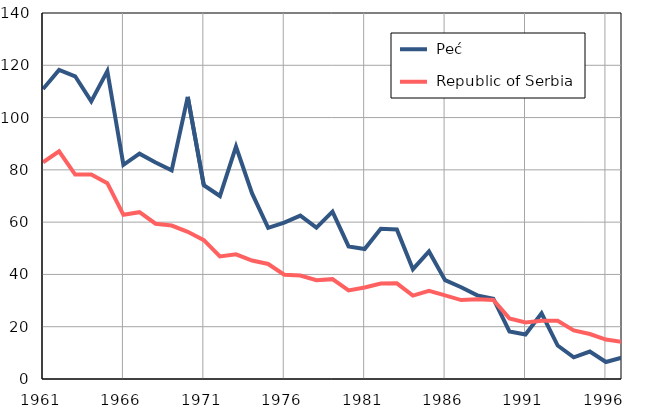
| Category |  Peć |  Republic of Serbia |
|---|---|---|
| 1961.0 | 110.9 | 82.9 |
| 1962.0 | 118.2 | 87.1 |
| 1963.0 | 115.8 | 78.2 |
| 1964.0 | 106.2 | 78.2 |
| 1965.0 | 117.8 | 74.9 |
| 1966.0 | 81.9 | 62.8 |
| 1967.0 | 86.2 | 63.8 |
| 1968.0 | 82.8 | 59.4 |
| 1969.0 | 79.8 | 58.7 |
| 1970.0 | 107.9 | 56.3 |
| 1971.0 | 74.1 | 53.1 |
| 1972.0 | 70 | 46.9 |
| 1973.0 | 88.9 | 47.7 |
| 1974.0 | 71 | 45.3 |
| 1975.0 | 57.8 | 44 |
| 1976.0 | 59.8 | 39.9 |
| 1977.0 | 62.5 | 39.6 |
| 1978.0 | 57.9 | 37.8 |
| 1979.0 | 64 | 38.2 |
| 1980.0 | 50.7 | 33.9 |
| 1981.0 | 49.7 | 35 |
| 1982.0 | 57.5 | 36.5 |
| 1983.0 | 57.2 | 36.6 |
| 1984.0 | 42 | 31.9 |
| 1985.0 | 48.8 | 33.7 |
| 1986.0 | 37.8 | 32 |
| 1987.0 | 35.1 | 30.2 |
| 1988.0 | 32 | 30.5 |
| 1989.0 | 30.7 | 30.2 |
| 1990.0 | 18.2 | 23.2 |
| 1991.0 | 17 | 21.6 |
| 1992.0 | 25.1 | 22.3 |
| 1993.0 | 12.8 | 22.3 |
| 1994.0 | 8.3 | 18.6 |
| 1995.0 | 10.5 | 17.2 |
| 1996.0 | 6.5 | 15.1 |
| 1997.0 | 8.2 | 14.2 |